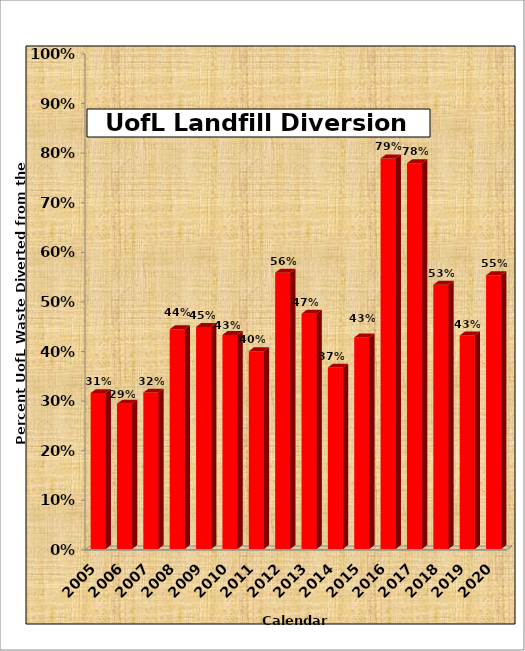
| Category | Calendar Year |
|---|---|
| 2020 | 0.552 |
| 2019 | 0.43 |
| 2018 | 0.533 |
| 2017 | 0.778 |
| 2016 | 0.788 |
| 2015 | 0.427 |
| 2014 | 0.366 |
| 2013 | 0.474 |
| 2012 | 0.557 |
| 2011 | 0.399 |
| 2010 | 0.432 |
| 2009 | 0.448 |
| 2008 | 0.443 |
| 2007 | 0.315 |
| 2006 | 0.293 |
| 2005 | 0.314 |